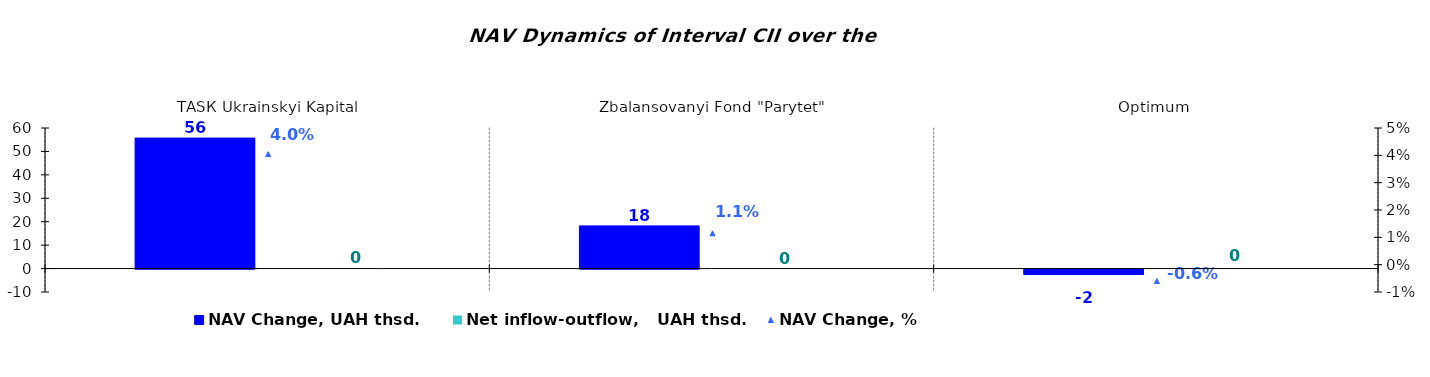
| Category | NAV Change, UAH thsd. | Net inflow-outflow,   UAH thsd. |
|---|---|---|
| ТАSК Ukrainskyi Kapital | 55.702 | 0 |
| Zbalansovanyi Fond "Parytet" | 18.219 | 0 |
| Оptimum | -2.327 | 0 |